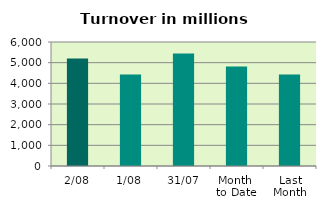
| Category | Series 0 |
|---|---|
| 2/08 | 5200.914 |
| 1/08 | 4423.391 |
| 31/07 | 5444.79 |
| Month 
to Date | 4812.153 |
| Last
Month | 4433.065 |